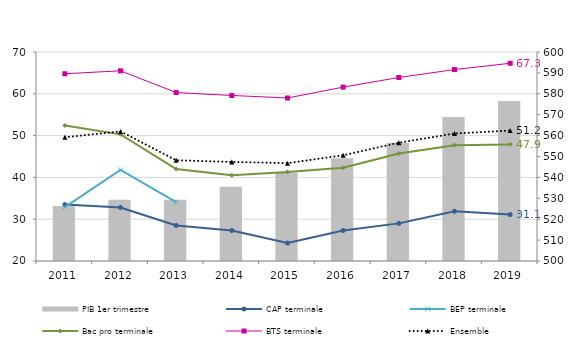
| Category | PIB 1er trimestre |
|---|---|
| 2011.0 | 526.286 |
| 2012.0 | 529.356 |
| 2013.0 | 529.29 |
| 2014.0 | 535.512 |
| 2015.0 | 542.195 |
| 2016.0 | 549.134 |
| 2017.0 | 556.591 |
| 2018.0 | 568.865 |
| 2019.0 | 576.535 |